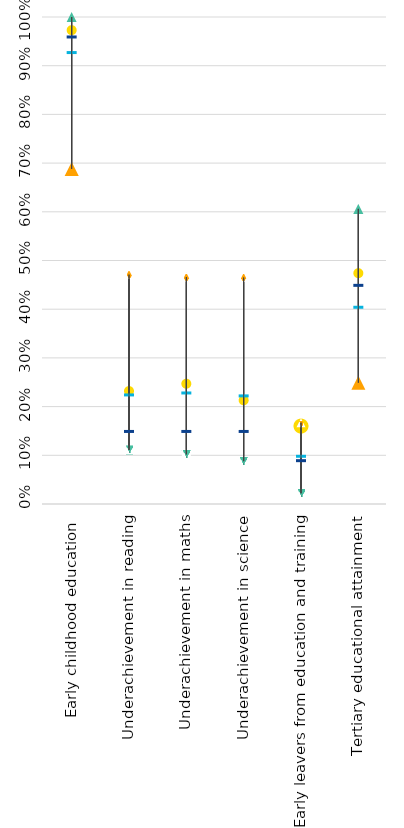
| Category | Spain | Strongest performer | Weakest performer | EU average | EU target |
|---|---|---|---|---|---|
| Early childhood education  | 0.973 | 1 | 0.688 | 0.928 | 0.96 |
| Underachievement in reading | 0.232 | 0.111 | 0.471 | 0.225 | 0.15 |
| Underachievement in maths | 0.247 | 0.102 | 0.466 | 0.229 | 0.15 |
| Underachievement in science | 0.213 | 0.088 | 0.465 | 0.223 | 0.15 |
| Early leavers from education and training | 0.16 | 0.022 | 0.167 | 0.099 | 0.09 |
| Tertiary educational attainment | 0.474 | 0.606 | 0.249 | 0.405 | 0.45 |